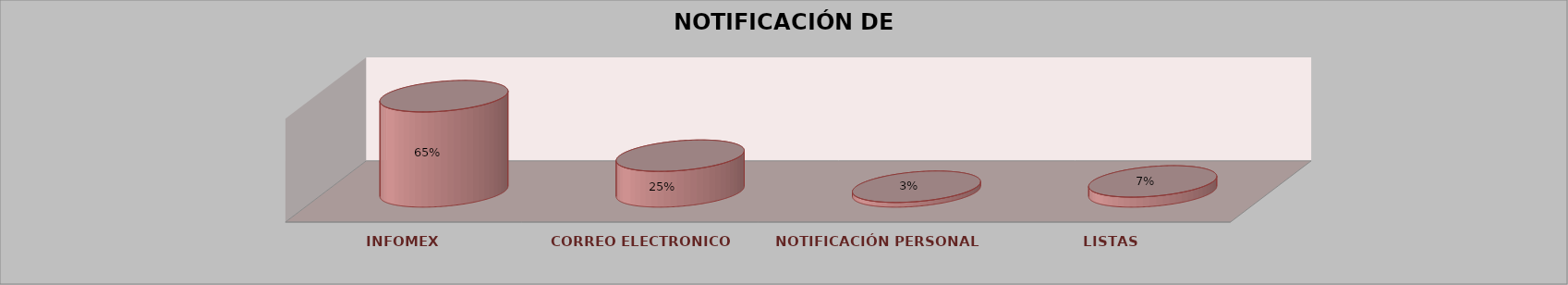
| Category | Series 0 | Series 1 | Series 2 | Series 3 | Series 4 |
|---|---|---|---|---|---|
| INFOMEX |  |  |  | 322 | 0.653 |
| CORREO ELECTRONICO |  |  |  | 121 | 0.245 |
| NOTIFICACIÓN PERSONAL |  |  |  | 16 | 0.032 |
| LISTAS |  |  |  | 34 | 0.069 |